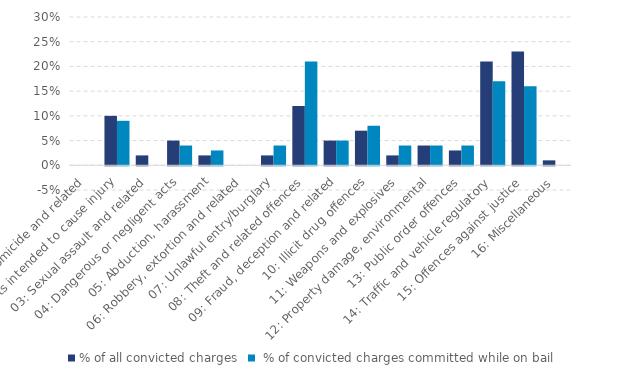
| Category | % of all convicted charges |  % of convicted charges committed while on bail |
|---|---|---|
| 01: Homicide and related | 0 | 0 |
| 02: Acts intended to cause injury | 0.1 | 0.09 |
| 03: Sexual assault and related | 0.02 | 0 |
| 04: Dangerous or negligent acts | 0.05 | 0.04 |
| 05: Abduction, harassment | 0.02 | 0.03 |
| 06: Robbery, extortion and related | 0 | 0 |
| 07: Unlawful entry/burglary | 0.02 | 0.04 |
| 08: Theft and related offences | 0.12 | 0.21 |
| 09: Fraud, deception and related | 0.05 | 0.05 |
| 10: Illicit drug offences | 0.07 | 0.08 |
| 11: Weapons and explosives | 0.02 | 0.04 |
| 12: Property damage, environmental | 0.04 | 0.04 |
| 13: Public order offences | 0.03 | 0.04 |
| 14: Traffic and vehicle regulatory | 0.21 | 0.17 |
| 15: Offences against justice | 0.23 | 0.16 |
| 16: Miscellaneous | 0.01 | 0 |